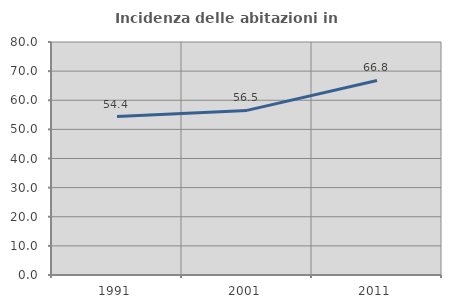
| Category | Incidenza delle abitazioni in proprietà  |
|---|---|
| 1991.0 | 54.397 |
| 2001.0 | 56.522 |
| 2011.0 | 66.805 |